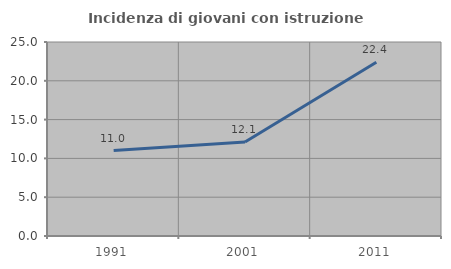
| Category | Incidenza di giovani con istruzione universitaria |
|---|---|
| 1991.0 | 11.015 |
| 2001.0 | 12.11 |
| 2011.0 | 22.4 |